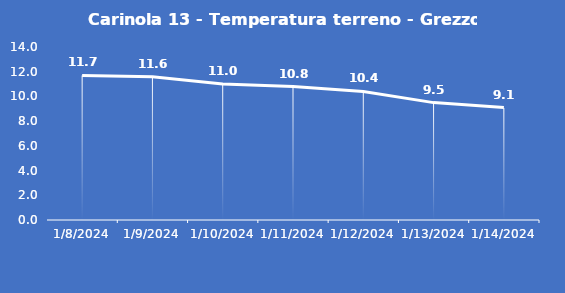
| Category | Carinola 13 - Temperatura terreno - Grezzo (°C) |
|---|---|
| 1/8/24 | 11.7 |
| 1/9/24 | 11.6 |
| 1/10/24 | 11 |
| 1/11/24 | 10.8 |
| 1/12/24 | 10.4 |
| 1/13/24 | 9.5 |
| 1/14/24 | 9.1 |